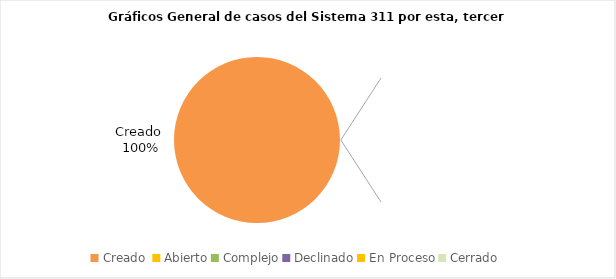
| Category | Series 0 |
|---|---|
| Creado  | 1 |
| Abierto | 0 |
| Complejo | 0 |
| Declinado | 0 |
| En Proceso | 0 |
| Cerrado  | 0 |